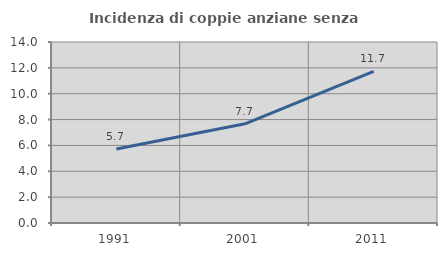
| Category | Incidenza di coppie anziane senza figli  |
|---|---|
| 1991.0 | 5.731 |
| 2001.0 | 7.673 |
| 2011.0 | 11.731 |